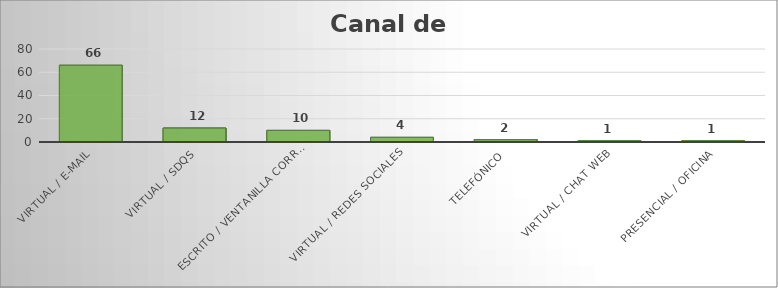
| Category | Series 0 |
|---|---|
| VIRTUAL / E-MAIL | 66 |
| VIRTUAL / SDQS | 12 |
| ESCRITO / VENTANILLA CORRESPONDENCIA | 10 |
| VIRTUAL / REDES SOCIALES | 4 |
| TELEFÓNICO | 2 |
| VIRTUAL / CHAT WEB | 1 |
| PRESENCIAL / OFICINA | 1 |